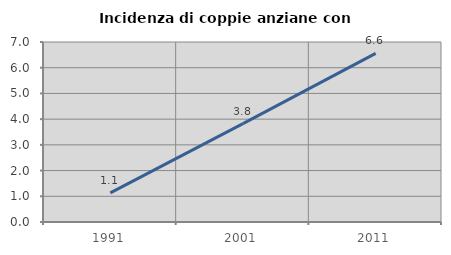
| Category | Incidenza di coppie anziane con figli |
|---|---|
| 1991.0 | 1.13 |
| 2001.0 | 3.825 |
| 2011.0 | 6.557 |